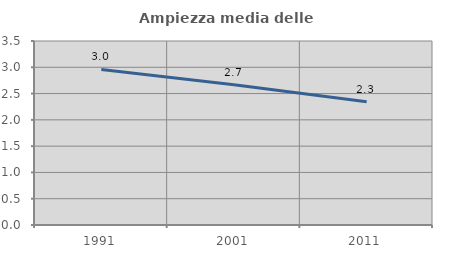
| Category | Ampiezza media delle famiglie |
|---|---|
| 1991.0 | 2.958 |
| 2001.0 | 2.67 |
| 2011.0 | 2.343 |